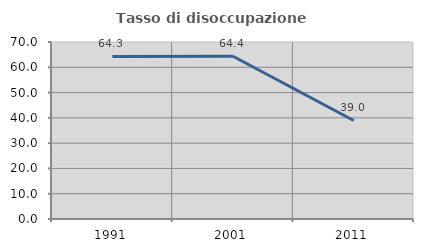
| Category | Tasso di disoccupazione giovanile  |
|---|---|
| 1991.0 | 64.297 |
| 2001.0 | 64.358 |
| 2011.0 | 38.958 |